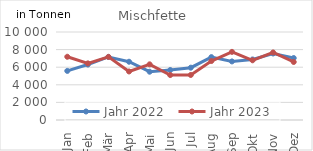
| Category | Jahr 2022 | Jahr 2023 |
|---|---|---|
| Jan | 5579 | 7186 |
| Feb | 6302 | 6433 |
| Mär | 7165 | 7174 |
| Apr | 6621 | 5515 |
| Mai | 5486 | 6326 |
| Jun | 5679 | 5109 |
| Jul | 5945 | 5117 |
| Aug | 7145 | 6701 |
| Sep | 6656 | 7743 |
| Okt | 6878 | 6786 |
| Nov | 7558 | 7676 |
| Dez | 7041 | 6594 |